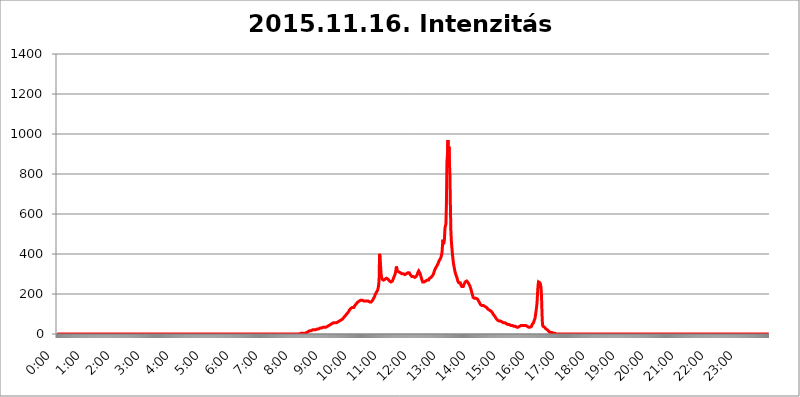
| Category | 2015.11.16. Intenzitás [W/m^2] |
|---|---|
| 0.0 | 0 |
| 0.0006944444444444445 | 0 |
| 0.001388888888888889 | 0 |
| 0.0020833333333333333 | 0 |
| 0.002777777777777778 | 0 |
| 0.003472222222222222 | 0 |
| 0.004166666666666667 | 0 |
| 0.004861111111111111 | 0 |
| 0.005555555555555556 | 0 |
| 0.0062499999999999995 | 0 |
| 0.006944444444444444 | 0 |
| 0.007638888888888889 | 0 |
| 0.008333333333333333 | 0 |
| 0.009027777777777779 | 0 |
| 0.009722222222222222 | 0 |
| 0.010416666666666666 | 0 |
| 0.011111111111111112 | 0 |
| 0.011805555555555555 | 0 |
| 0.012499999999999999 | 0 |
| 0.013194444444444444 | 0 |
| 0.013888888888888888 | 0 |
| 0.014583333333333332 | 0 |
| 0.015277777777777777 | 0 |
| 0.015972222222222224 | 0 |
| 0.016666666666666666 | 0 |
| 0.017361111111111112 | 0 |
| 0.018055555555555557 | 0 |
| 0.01875 | 0 |
| 0.019444444444444445 | 0 |
| 0.02013888888888889 | 0 |
| 0.020833333333333332 | 0 |
| 0.02152777777777778 | 0 |
| 0.022222222222222223 | 0 |
| 0.02291666666666667 | 0 |
| 0.02361111111111111 | 0 |
| 0.024305555555555556 | 0 |
| 0.024999999999999998 | 0 |
| 0.025694444444444447 | 0 |
| 0.02638888888888889 | 0 |
| 0.027083333333333334 | 0 |
| 0.027777777777777776 | 0 |
| 0.02847222222222222 | 0 |
| 0.029166666666666664 | 0 |
| 0.029861111111111113 | 0 |
| 0.030555555555555555 | 0 |
| 0.03125 | 0 |
| 0.03194444444444445 | 0 |
| 0.03263888888888889 | 0 |
| 0.03333333333333333 | 0 |
| 0.034027777777777775 | 0 |
| 0.034722222222222224 | 0 |
| 0.035416666666666666 | 0 |
| 0.036111111111111115 | 0 |
| 0.03680555555555556 | 0 |
| 0.0375 | 0 |
| 0.03819444444444444 | 0 |
| 0.03888888888888889 | 0 |
| 0.03958333333333333 | 0 |
| 0.04027777777777778 | 0 |
| 0.04097222222222222 | 0 |
| 0.041666666666666664 | 0 |
| 0.042361111111111106 | 0 |
| 0.04305555555555556 | 0 |
| 0.043750000000000004 | 0 |
| 0.044444444444444446 | 0 |
| 0.04513888888888889 | 0 |
| 0.04583333333333334 | 0 |
| 0.04652777777777778 | 0 |
| 0.04722222222222222 | 0 |
| 0.04791666666666666 | 0 |
| 0.04861111111111111 | 0 |
| 0.049305555555555554 | 0 |
| 0.049999999999999996 | 0 |
| 0.05069444444444445 | 0 |
| 0.051388888888888894 | 0 |
| 0.052083333333333336 | 0 |
| 0.05277777777777778 | 0 |
| 0.05347222222222222 | 0 |
| 0.05416666666666667 | 0 |
| 0.05486111111111111 | 0 |
| 0.05555555555555555 | 0 |
| 0.05625 | 0 |
| 0.05694444444444444 | 0 |
| 0.057638888888888885 | 0 |
| 0.05833333333333333 | 0 |
| 0.05902777777777778 | 0 |
| 0.059722222222222225 | 0 |
| 0.06041666666666667 | 0 |
| 0.061111111111111116 | 0 |
| 0.06180555555555556 | 0 |
| 0.0625 | 0 |
| 0.06319444444444444 | 0 |
| 0.06388888888888888 | 0 |
| 0.06458333333333334 | 0 |
| 0.06527777777777778 | 0 |
| 0.06597222222222222 | 0 |
| 0.06666666666666667 | 0 |
| 0.06736111111111111 | 0 |
| 0.06805555555555555 | 0 |
| 0.06874999999999999 | 0 |
| 0.06944444444444443 | 0 |
| 0.07013888888888889 | 0 |
| 0.07083333333333333 | 0 |
| 0.07152777777777779 | 0 |
| 0.07222222222222223 | 0 |
| 0.07291666666666667 | 0 |
| 0.07361111111111111 | 0 |
| 0.07430555555555556 | 0 |
| 0.075 | 0 |
| 0.07569444444444444 | 0 |
| 0.0763888888888889 | 0 |
| 0.07708333333333334 | 0 |
| 0.07777777777777778 | 0 |
| 0.07847222222222222 | 0 |
| 0.07916666666666666 | 0 |
| 0.0798611111111111 | 0 |
| 0.08055555555555556 | 0 |
| 0.08125 | 0 |
| 0.08194444444444444 | 0 |
| 0.08263888888888889 | 0 |
| 0.08333333333333333 | 0 |
| 0.08402777777777777 | 0 |
| 0.08472222222222221 | 0 |
| 0.08541666666666665 | 0 |
| 0.08611111111111112 | 0 |
| 0.08680555555555557 | 0 |
| 0.08750000000000001 | 0 |
| 0.08819444444444445 | 0 |
| 0.08888888888888889 | 0 |
| 0.08958333333333333 | 0 |
| 0.09027777777777778 | 0 |
| 0.09097222222222222 | 0 |
| 0.09166666666666667 | 0 |
| 0.09236111111111112 | 0 |
| 0.09305555555555556 | 0 |
| 0.09375 | 0 |
| 0.09444444444444444 | 0 |
| 0.09513888888888888 | 0 |
| 0.09583333333333333 | 0 |
| 0.09652777777777777 | 0 |
| 0.09722222222222222 | 0 |
| 0.09791666666666667 | 0 |
| 0.09861111111111111 | 0 |
| 0.09930555555555555 | 0 |
| 0.09999999999999999 | 0 |
| 0.10069444444444443 | 0 |
| 0.1013888888888889 | 0 |
| 0.10208333333333335 | 0 |
| 0.10277777777777779 | 0 |
| 0.10347222222222223 | 0 |
| 0.10416666666666667 | 0 |
| 0.10486111111111111 | 0 |
| 0.10555555555555556 | 0 |
| 0.10625 | 0 |
| 0.10694444444444444 | 0 |
| 0.1076388888888889 | 0 |
| 0.10833333333333334 | 0 |
| 0.10902777777777778 | 0 |
| 0.10972222222222222 | 0 |
| 0.1111111111111111 | 0 |
| 0.11180555555555556 | 0 |
| 0.11180555555555556 | 0 |
| 0.1125 | 0 |
| 0.11319444444444444 | 0 |
| 0.11388888888888889 | 0 |
| 0.11458333333333333 | 0 |
| 0.11527777777777777 | 0 |
| 0.11597222222222221 | 0 |
| 0.11666666666666665 | 0 |
| 0.1173611111111111 | 0 |
| 0.11805555555555557 | 0 |
| 0.11944444444444445 | 0 |
| 0.12013888888888889 | 0 |
| 0.12083333333333333 | 0 |
| 0.12152777777777778 | 0 |
| 0.12222222222222223 | 0 |
| 0.12291666666666667 | 0 |
| 0.12291666666666667 | 0 |
| 0.12361111111111112 | 0 |
| 0.12430555555555556 | 0 |
| 0.125 | 0 |
| 0.12569444444444444 | 0 |
| 0.12638888888888888 | 0 |
| 0.12708333333333333 | 0 |
| 0.16875 | 0 |
| 0.12847222222222224 | 0 |
| 0.12916666666666668 | 0 |
| 0.12986111111111112 | 0 |
| 0.13055555555555556 | 0 |
| 0.13125 | 0 |
| 0.13194444444444445 | 0 |
| 0.1326388888888889 | 0 |
| 0.13333333333333333 | 0 |
| 0.13402777777777777 | 0 |
| 0.13402777777777777 | 0 |
| 0.13472222222222222 | 0 |
| 0.13541666666666666 | 0 |
| 0.1361111111111111 | 0 |
| 0.13749999999999998 | 0 |
| 0.13819444444444443 | 0 |
| 0.1388888888888889 | 0 |
| 0.13958333333333334 | 0 |
| 0.14027777777777778 | 0 |
| 0.14097222222222222 | 0 |
| 0.14166666666666666 | 0 |
| 0.1423611111111111 | 0 |
| 0.14305555555555557 | 0 |
| 0.14375000000000002 | 0 |
| 0.14444444444444446 | 0 |
| 0.1451388888888889 | 0 |
| 0.1451388888888889 | 0 |
| 0.14652777777777778 | 0 |
| 0.14722222222222223 | 0 |
| 0.14791666666666667 | 0 |
| 0.1486111111111111 | 0 |
| 0.14930555555555555 | 0 |
| 0.15 | 0 |
| 0.15069444444444444 | 0 |
| 0.15138888888888888 | 0 |
| 0.15208333333333332 | 0 |
| 0.15277777777777776 | 0 |
| 0.15347222222222223 | 0 |
| 0.15416666666666667 | 0 |
| 0.15486111111111112 | 0 |
| 0.15555555555555556 | 0 |
| 0.15625 | 0 |
| 0.15694444444444444 | 0 |
| 0.15763888888888888 | 0 |
| 0.15833333333333333 | 0 |
| 0.15902777777777777 | 0 |
| 0.15972222222222224 | 0 |
| 0.16041666666666668 | 0 |
| 0.16111111111111112 | 0 |
| 0.16180555555555556 | 0 |
| 0.1625 | 0 |
| 0.16319444444444445 | 0 |
| 0.1638888888888889 | 0 |
| 0.16458333333333333 | 0 |
| 0.16527777777777777 | 0 |
| 0.16597222222222222 | 0 |
| 0.16666666666666666 | 0 |
| 0.1673611111111111 | 0 |
| 0.16805555555555554 | 0 |
| 0.16874999999999998 | 0 |
| 0.16944444444444443 | 0 |
| 0.17013888888888887 | 0 |
| 0.1708333333333333 | 0 |
| 0.17152777777777775 | 0 |
| 0.17222222222222225 | 0 |
| 0.1729166666666667 | 0 |
| 0.17361111111111113 | 0 |
| 0.17430555555555557 | 0 |
| 0.17500000000000002 | 0 |
| 0.17569444444444446 | 0 |
| 0.1763888888888889 | 0 |
| 0.17708333333333334 | 0 |
| 0.17777777777777778 | 0 |
| 0.17847222222222223 | 0 |
| 0.17916666666666667 | 0 |
| 0.1798611111111111 | 0 |
| 0.18055555555555555 | 0 |
| 0.18125 | 0 |
| 0.18194444444444444 | 0 |
| 0.1826388888888889 | 0 |
| 0.18333333333333335 | 0 |
| 0.1840277777777778 | 0 |
| 0.18472222222222223 | 0 |
| 0.18541666666666667 | 0 |
| 0.18611111111111112 | 0 |
| 0.18680555555555556 | 0 |
| 0.1875 | 0 |
| 0.18819444444444444 | 0 |
| 0.18888888888888888 | 0 |
| 0.18958333333333333 | 0 |
| 0.19027777777777777 | 0 |
| 0.1909722222222222 | 0 |
| 0.19166666666666665 | 0 |
| 0.19236111111111112 | 0 |
| 0.19305555555555554 | 0 |
| 0.19375 | 0 |
| 0.19444444444444445 | 0 |
| 0.1951388888888889 | 0 |
| 0.19583333333333333 | 0 |
| 0.19652777777777777 | 0 |
| 0.19722222222222222 | 0 |
| 0.19791666666666666 | 0 |
| 0.1986111111111111 | 0 |
| 0.19930555555555554 | 0 |
| 0.19999999999999998 | 0 |
| 0.20069444444444443 | 0 |
| 0.20138888888888887 | 0 |
| 0.2020833333333333 | 0 |
| 0.2027777777777778 | 0 |
| 0.2034722222222222 | 0 |
| 0.2041666666666667 | 0 |
| 0.20486111111111113 | 0 |
| 0.20555555555555557 | 0 |
| 0.20625000000000002 | 0 |
| 0.20694444444444446 | 0 |
| 0.2076388888888889 | 0 |
| 0.20833333333333334 | 0 |
| 0.20902777777777778 | 0 |
| 0.20972222222222223 | 0 |
| 0.21041666666666667 | 0 |
| 0.2111111111111111 | 0 |
| 0.21180555555555555 | 0 |
| 0.2125 | 0 |
| 0.21319444444444444 | 0 |
| 0.2138888888888889 | 0 |
| 0.21458333333333335 | 0 |
| 0.2152777777777778 | 0 |
| 0.21597222222222223 | 0 |
| 0.21666666666666667 | 0 |
| 0.21736111111111112 | 0 |
| 0.21805555555555556 | 0 |
| 0.21875 | 0 |
| 0.21944444444444444 | 0 |
| 0.22013888888888888 | 0 |
| 0.22083333333333333 | 0 |
| 0.22152777777777777 | 0 |
| 0.2222222222222222 | 0 |
| 0.22291666666666665 | 0 |
| 0.2236111111111111 | 0 |
| 0.22430555555555556 | 0 |
| 0.225 | 0 |
| 0.22569444444444445 | 0 |
| 0.2263888888888889 | 0 |
| 0.22708333333333333 | 0 |
| 0.22777777777777777 | 0 |
| 0.22847222222222222 | 0 |
| 0.22916666666666666 | 0 |
| 0.2298611111111111 | 0 |
| 0.23055555555555554 | 0 |
| 0.23124999999999998 | 0 |
| 0.23194444444444443 | 0 |
| 0.23263888888888887 | 0 |
| 0.2333333333333333 | 0 |
| 0.2340277777777778 | 0 |
| 0.2347222222222222 | 0 |
| 0.2354166666666667 | 0 |
| 0.23611111111111113 | 0 |
| 0.23680555555555557 | 0 |
| 0.23750000000000002 | 0 |
| 0.23819444444444446 | 0 |
| 0.2388888888888889 | 0 |
| 0.23958333333333334 | 0 |
| 0.24027777777777778 | 0 |
| 0.24097222222222223 | 0 |
| 0.24166666666666667 | 0 |
| 0.2423611111111111 | 0 |
| 0.24305555555555555 | 0 |
| 0.24375 | 0 |
| 0.24444444444444446 | 0 |
| 0.24513888888888888 | 0 |
| 0.24583333333333335 | 0 |
| 0.2465277777777778 | 0 |
| 0.24722222222222223 | 0 |
| 0.24791666666666667 | 0 |
| 0.24861111111111112 | 0 |
| 0.24930555555555556 | 0 |
| 0.25 | 0 |
| 0.25069444444444444 | 0 |
| 0.2513888888888889 | 0 |
| 0.2520833333333333 | 0 |
| 0.25277777777777777 | 0 |
| 0.2534722222222222 | 0 |
| 0.25416666666666665 | 0 |
| 0.2548611111111111 | 0 |
| 0.2555555555555556 | 0 |
| 0.25625000000000003 | 0 |
| 0.2569444444444445 | 0 |
| 0.2576388888888889 | 0 |
| 0.25833333333333336 | 0 |
| 0.2590277777777778 | 0 |
| 0.25972222222222224 | 0 |
| 0.2604166666666667 | 0 |
| 0.2611111111111111 | 0 |
| 0.26180555555555557 | 0 |
| 0.2625 | 0 |
| 0.26319444444444445 | 0 |
| 0.2638888888888889 | 0 |
| 0.26458333333333334 | 0 |
| 0.2652777777777778 | 0 |
| 0.2659722222222222 | 0 |
| 0.26666666666666666 | 0 |
| 0.2673611111111111 | 0 |
| 0.26805555555555555 | 0 |
| 0.26875 | 0 |
| 0.26944444444444443 | 0 |
| 0.2701388888888889 | 0 |
| 0.2708333333333333 | 0 |
| 0.27152777777777776 | 0 |
| 0.2722222222222222 | 0 |
| 0.27291666666666664 | 0 |
| 0.2736111111111111 | 0 |
| 0.2743055555555555 | 0 |
| 0.27499999999999997 | 0 |
| 0.27569444444444446 | 0 |
| 0.27638888888888885 | 0 |
| 0.27708333333333335 | 0 |
| 0.2777777777777778 | 0 |
| 0.27847222222222223 | 0 |
| 0.2791666666666667 | 0 |
| 0.2798611111111111 | 0 |
| 0.28055555555555556 | 0 |
| 0.28125 | 0 |
| 0.28194444444444444 | 0 |
| 0.2826388888888889 | 0 |
| 0.2833333333333333 | 0 |
| 0.28402777777777777 | 0 |
| 0.2847222222222222 | 0 |
| 0.28541666666666665 | 0 |
| 0.28611111111111115 | 0 |
| 0.28680555555555554 | 0 |
| 0.28750000000000003 | 0 |
| 0.2881944444444445 | 0 |
| 0.2888888888888889 | 0 |
| 0.28958333333333336 | 0 |
| 0.2902777777777778 | 0 |
| 0.29097222222222224 | 0 |
| 0.2916666666666667 | 0 |
| 0.2923611111111111 | 0 |
| 0.29305555555555557 | 0 |
| 0.29375 | 0 |
| 0.29444444444444445 | 0 |
| 0.2951388888888889 | 0 |
| 0.29583333333333334 | 0 |
| 0.2965277777777778 | 0 |
| 0.2972222222222222 | 0 |
| 0.29791666666666666 | 0 |
| 0.2986111111111111 | 0 |
| 0.29930555555555555 | 0 |
| 0.3 | 0 |
| 0.30069444444444443 | 0 |
| 0.3013888888888889 | 0 |
| 0.3020833333333333 | 0 |
| 0.30277777777777776 | 0 |
| 0.3034722222222222 | 0 |
| 0.30416666666666664 | 0 |
| 0.3048611111111111 | 0 |
| 0.3055555555555555 | 0 |
| 0.30624999999999997 | 0 |
| 0.3069444444444444 | 0 |
| 0.3076388888888889 | 0 |
| 0.30833333333333335 | 0 |
| 0.3090277777777778 | 0 |
| 0.30972222222222223 | 0 |
| 0.3104166666666667 | 0 |
| 0.3111111111111111 | 0 |
| 0.31180555555555556 | 0 |
| 0.3125 | 0 |
| 0.31319444444444444 | 0 |
| 0.3138888888888889 | 0 |
| 0.3145833333333333 | 0 |
| 0.31527777777777777 | 0 |
| 0.3159722222222222 | 0 |
| 0.31666666666666665 | 0 |
| 0.31736111111111115 | 0 |
| 0.31805555555555554 | 0 |
| 0.31875000000000003 | 0 |
| 0.3194444444444445 | 0 |
| 0.3201388888888889 | 0 |
| 0.32083333333333336 | 0 |
| 0.3215277777777778 | 0 |
| 0.32222222222222224 | 0 |
| 0.3229166666666667 | 0 |
| 0.3236111111111111 | 0 |
| 0.32430555555555557 | 0 |
| 0.325 | 0 |
| 0.32569444444444445 | 0 |
| 0.3263888888888889 | 0 |
| 0.32708333333333334 | 0 |
| 0.3277777777777778 | 0 |
| 0.3284722222222222 | 0 |
| 0.32916666666666666 | 0 |
| 0.3298611111111111 | 0 |
| 0.33055555555555555 | 0 |
| 0.33125 | 0 |
| 0.33194444444444443 | 0 |
| 0.3326388888888889 | 0 |
| 0.3333333333333333 | 0 |
| 0.3340277777777778 | 0 |
| 0.3347222222222222 | 0 |
| 0.3354166666666667 | 0 |
| 0.3361111111111111 | 0 |
| 0.3368055555555556 | 0 |
| 0.33749999999999997 | 0 |
| 0.33819444444444446 | 0 |
| 0.33888888888888885 | 0 |
| 0.33958333333333335 | 0 |
| 0.34027777777777773 | 3.525 |
| 0.34097222222222223 | 3.525 |
| 0.3416666666666666 | 3.525 |
| 0.3423611111111111 | 3.525 |
| 0.3430555555555555 | 3.525 |
| 0.34375 | 3.525 |
| 0.3444444444444445 | 3.525 |
| 0.3451388888888889 | 3.525 |
| 0.3458333333333334 | 3.525 |
| 0.34652777777777777 | 3.525 |
| 0.34722222222222227 | 3.525 |
| 0.34791666666666665 | 3.525 |
| 0.34861111111111115 | 3.525 |
| 0.34930555555555554 | 7.887 |
| 0.35000000000000003 | 7.887 |
| 0.3506944444444444 | 7.887 |
| 0.3513888888888889 | 12.257 |
| 0.3520833333333333 | 12.257 |
| 0.3527777777777778 | 12.257 |
| 0.3534722222222222 | 12.257 |
| 0.3541666666666667 | 16.636 |
| 0.3548611111111111 | 16.636 |
| 0.35555555555555557 | 16.636 |
| 0.35625 | 16.636 |
| 0.35694444444444445 | 16.636 |
| 0.3576388888888889 | 16.636 |
| 0.35833333333333334 | 21.024 |
| 0.3590277777777778 | 21.024 |
| 0.3597222222222222 | 21.024 |
| 0.36041666666666666 | 21.024 |
| 0.3611111111111111 | 21.024 |
| 0.36180555555555555 | 21.024 |
| 0.3625 | 21.024 |
| 0.36319444444444443 | 21.024 |
| 0.3638888888888889 | 25.419 |
| 0.3645833333333333 | 25.419 |
| 0.3652777777777778 | 25.419 |
| 0.3659722222222222 | 25.419 |
| 0.3666666666666667 | 25.419 |
| 0.3673611111111111 | 25.419 |
| 0.3680555555555556 | 29.823 |
| 0.36874999999999997 | 29.823 |
| 0.36944444444444446 | 25.419 |
| 0.37013888888888885 | 29.823 |
| 0.37083333333333335 | 29.823 |
| 0.37152777777777773 | 29.823 |
| 0.37222222222222223 | 29.823 |
| 0.3729166666666666 | 34.234 |
| 0.3736111111111111 | 34.234 |
| 0.3743055555555555 | 34.234 |
| 0.375 | 34.234 |
| 0.3756944444444445 | 34.234 |
| 0.3763888888888889 | 34.234 |
| 0.3770833333333334 | 34.234 |
| 0.37777777777777777 | 38.653 |
| 0.37847222222222227 | 38.653 |
| 0.37916666666666665 | 38.653 |
| 0.37986111111111115 | 38.653 |
| 0.38055555555555554 | 38.653 |
| 0.38125000000000003 | 43.079 |
| 0.3819444444444444 | 43.079 |
| 0.3826388888888889 | 47.511 |
| 0.3833333333333333 | 47.511 |
| 0.3840277777777778 | 51.951 |
| 0.3847222222222222 | 51.951 |
| 0.3854166666666667 | 51.951 |
| 0.3861111111111111 | 56.398 |
| 0.38680555555555557 | 51.951 |
| 0.3875 | 56.398 |
| 0.38819444444444445 | 56.398 |
| 0.3888888888888889 | 56.398 |
| 0.38958333333333334 | 56.398 |
| 0.3902777777777778 | 56.398 |
| 0.3909722222222222 | 56.398 |
| 0.39166666666666666 | 56.398 |
| 0.3923611111111111 | 56.398 |
| 0.39305555555555555 | 56.398 |
| 0.39375 | 60.85 |
| 0.39444444444444443 | 60.85 |
| 0.3951388888888889 | 60.85 |
| 0.3958333333333333 | 65.31 |
| 0.3965277777777778 | 65.31 |
| 0.3972222222222222 | 65.31 |
| 0.3979166666666667 | 69.775 |
| 0.3986111111111111 | 69.775 |
| 0.3993055555555556 | 69.775 |
| 0.39999999999999997 | 74.246 |
| 0.40069444444444446 | 74.246 |
| 0.40138888888888885 | 78.722 |
| 0.40208333333333335 | 83.205 |
| 0.40277777777777773 | 83.205 |
| 0.40347222222222223 | 87.692 |
| 0.4041666666666666 | 92.184 |
| 0.4048611111111111 | 92.184 |
| 0.4055555555555555 | 96.682 |
| 0.40625 | 101.184 |
| 0.4069444444444445 | 101.184 |
| 0.4076388888888889 | 105.69 |
| 0.4083333333333334 | 110.201 |
| 0.40902777777777777 | 114.716 |
| 0.40972222222222227 | 119.235 |
| 0.41041666666666665 | 119.235 |
| 0.41111111111111115 | 123.758 |
| 0.41180555555555554 | 128.284 |
| 0.41250000000000003 | 128.284 |
| 0.4131944444444444 | 132.814 |
| 0.4138888888888889 | 132.814 |
| 0.4145833333333333 | 128.284 |
| 0.4152777777777778 | 132.814 |
| 0.4159722222222222 | 132.814 |
| 0.4166666666666667 | 137.347 |
| 0.4173611111111111 | 141.884 |
| 0.41805555555555557 | 146.423 |
| 0.41875 | 146.423 |
| 0.41944444444444445 | 150.964 |
| 0.4201388888888889 | 155.509 |
| 0.42083333333333334 | 155.509 |
| 0.4215277777777778 | 160.056 |
| 0.4222222222222222 | 160.056 |
| 0.42291666666666666 | 164.605 |
| 0.4236111111111111 | 164.605 |
| 0.42430555555555555 | 164.605 |
| 0.425 | 164.605 |
| 0.42569444444444443 | 169.156 |
| 0.4263888888888889 | 169.156 |
| 0.4270833333333333 | 169.156 |
| 0.4277777777777778 | 169.156 |
| 0.4284722222222222 | 169.156 |
| 0.4291666666666667 | 164.605 |
| 0.4298611111111111 | 164.605 |
| 0.4305555555555556 | 164.605 |
| 0.43124999999999997 | 164.605 |
| 0.43194444444444446 | 164.605 |
| 0.43263888888888885 | 164.605 |
| 0.43333333333333335 | 169.156 |
| 0.43402777777777773 | 164.605 |
| 0.43472222222222223 | 164.605 |
| 0.4354166666666666 | 164.605 |
| 0.4361111111111111 | 164.605 |
| 0.4368055555555555 | 160.056 |
| 0.4375 | 160.056 |
| 0.4381944444444445 | 160.056 |
| 0.4388888888888889 | 160.056 |
| 0.4395833333333334 | 160.056 |
| 0.44027777777777777 | 160.056 |
| 0.44097222222222227 | 164.605 |
| 0.44166666666666665 | 164.605 |
| 0.44236111111111115 | 169.156 |
| 0.44305555555555554 | 173.709 |
| 0.44375000000000003 | 178.264 |
| 0.4444444444444444 | 182.82 |
| 0.4451388888888889 | 187.378 |
| 0.4458333333333333 | 196.497 |
| 0.4465277777777778 | 201.058 |
| 0.4472222222222222 | 201.058 |
| 0.4479166666666667 | 210.182 |
| 0.4486111111111111 | 210.182 |
| 0.44930555555555557 | 219.309 |
| 0.45 | 228.436 |
| 0.45069444444444445 | 242.127 |
| 0.4513888888888889 | 269.49 |
| 0.45208333333333334 | 400.638 |
| 0.4527777777777778 | 382.715 |
| 0.4534722222222222 | 342.162 |
| 0.45416666666666666 | 301.354 |
| 0.4548611111111111 | 283.156 |
| 0.45555555555555555 | 274.047 |
| 0.45625 | 269.49 |
| 0.45694444444444443 | 269.49 |
| 0.4576388888888889 | 269.49 |
| 0.4583333333333333 | 269.49 |
| 0.4590277777777778 | 269.49 |
| 0.4597222222222222 | 274.047 |
| 0.4604166666666667 | 274.047 |
| 0.4611111111111111 | 274.047 |
| 0.4618055555555556 | 278.603 |
| 0.46249999999999997 | 278.603 |
| 0.46319444444444446 | 278.603 |
| 0.46388888888888885 | 274.047 |
| 0.46458333333333335 | 274.047 |
| 0.46527777777777773 | 269.49 |
| 0.46597222222222223 | 264.932 |
| 0.4666666666666666 | 260.373 |
| 0.4673611111111111 | 260.373 |
| 0.4680555555555555 | 260.373 |
| 0.46875 | 260.373 |
| 0.4694444444444445 | 260.373 |
| 0.4701388888888889 | 264.932 |
| 0.4708333333333334 | 269.49 |
| 0.47152777777777777 | 278.603 |
| 0.47222222222222227 | 274.047 |
| 0.47291666666666665 | 283.156 |
| 0.47361111111111115 | 296.808 |
| 0.47430555555555554 | 305.898 |
| 0.47500000000000003 | 319.517 |
| 0.4756944444444444 | 337.639 |
| 0.4763888888888889 | 324.052 |
| 0.4770833333333333 | 314.98 |
| 0.4777777777777778 | 314.98 |
| 0.4784722222222222 | 314.98 |
| 0.4791666666666667 | 310.44 |
| 0.4798611111111111 | 310.44 |
| 0.48055555555555557 | 305.898 |
| 0.48125 | 305.898 |
| 0.48194444444444445 | 301.354 |
| 0.4826388888888889 | 301.354 |
| 0.48333333333333334 | 301.354 |
| 0.4840277777777778 | 305.898 |
| 0.4847222222222222 | 301.354 |
| 0.48541666666666666 | 301.354 |
| 0.4861111111111111 | 296.808 |
| 0.48680555555555555 | 296.808 |
| 0.4875 | 296.808 |
| 0.48819444444444443 | 296.808 |
| 0.4888888888888889 | 296.808 |
| 0.4895833333333333 | 301.354 |
| 0.4902777777777778 | 301.354 |
| 0.4909722222222222 | 305.898 |
| 0.4916666666666667 | 305.898 |
| 0.4923611111111111 | 305.898 |
| 0.4930555555555556 | 305.898 |
| 0.49374999999999997 | 305.898 |
| 0.49444444444444446 | 301.354 |
| 0.49513888888888885 | 296.808 |
| 0.49583333333333335 | 292.259 |
| 0.49652777777777773 | 292.259 |
| 0.49722222222222223 | 287.709 |
| 0.4979166666666666 | 287.709 |
| 0.4986111111111111 | 287.709 |
| 0.4993055555555555 | 287.709 |
| 0.5 | 283.156 |
| 0.5006944444444444 | 283.156 |
| 0.5013888888888889 | 283.156 |
| 0.5020833333333333 | 283.156 |
| 0.5027777777777778 | 287.709 |
| 0.5034722222222222 | 287.709 |
| 0.5041666666666667 | 292.259 |
| 0.5048611111111111 | 296.808 |
| 0.5055555555555555 | 305.898 |
| 0.50625 | 310.44 |
| 0.5069444444444444 | 314.98 |
| 0.5076388888888889 | 314.98 |
| 0.5083333333333333 | 310.44 |
| 0.5090277777777777 | 301.354 |
| 0.5097222222222222 | 292.259 |
| 0.5104166666666666 | 283.156 |
| 0.5111111111111112 | 274.047 |
| 0.5118055555555555 | 269.49 |
| 0.5125000000000001 | 260.373 |
| 0.5131944444444444 | 260.373 |
| 0.513888888888889 | 260.373 |
| 0.5145833333333333 | 260.373 |
| 0.5152777777777778 | 260.373 |
| 0.5159722222222222 | 264.932 |
| 0.5166666666666667 | 264.932 |
| 0.517361111111111 | 269.49 |
| 0.5180555555555556 | 269.49 |
| 0.5187499999999999 | 269.49 |
| 0.5194444444444445 | 269.49 |
| 0.5201388888888888 | 269.49 |
| 0.5208333333333334 | 269.49 |
| 0.5215277777777778 | 274.047 |
| 0.5222222222222223 | 278.603 |
| 0.5229166666666667 | 278.603 |
| 0.5236111111111111 | 278.603 |
| 0.5243055555555556 | 283.156 |
| 0.525 | 287.709 |
| 0.5256944444444445 | 287.709 |
| 0.5263888888888889 | 292.259 |
| 0.5270833333333333 | 296.808 |
| 0.5277777777777778 | 301.354 |
| 0.5284722222222222 | 310.44 |
| 0.5291666666666667 | 314.98 |
| 0.5298611111111111 | 324.052 |
| 0.5305555555555556 | 328.584 |
| 0.53125 | 333.113 |
| 0.5319444444444444 | 337.639 |
| 0.5326388888888889 | 342.162 |
| 0.5333333333333333 | 346.682 |
| 0.5340277777777778 | 351.198 |
| 0.5347222222222222 | 355.712 |
| 0.5354166666666667 | 364.728 |
| 0.5361111111111111 | 369.23 |
| 0.5368055555555555 | 373.729 |
| 0.5375 | 378.224 |
| 0.5381944444444444 | 382.715 |
| 0.5388888888888889 | 387.202 |
| 0.5395833333333333 | 405.108 |
| 0.5402777777777777 | 440.702 |
| 0.5409722222222222 | 471.582 |
| 0.5416666666666666 | 449.551 |
| 0.5423611111111112 | 458.38 |
| 0.5430555555555555 | 471.582 |
| 0.5437500000000001 | 528.2 |
| 0.5444444444444444 | 541.121 |
| 0.545138888888889 | 549.704 |
| 0.5458333333333333 | 650.667 |
| 0.5465277777777778 | 860.676 |
| 0.5472222222222222 | 894.885 |
| 0.5479166666666667 | 970.034 |
| 0.548611111111111 | 872.114 |
| 0.5493055555555556 | 936.33 |
| 0.5499999999999999 | 856.855 |
| 0.5506944444444445 | 798.974 |
| 0.5513888888888888 | 642.4 |
| 0.5520833333333334 | 515.223 |
| 0.5527777777777778 | 462.786 |
| 0.5534722222222223 | 431.833 |
| 0.5541666666666667 | 405.108 |
| 0.5548611111111111 | 378.224 |
| 0.5555555555555556 | 355.712 |
| 0.55625 | 342.162 |
| 0.5569444444444445 | 328.584 |
| 0.5576388888888889 | 314.98 |
| 0.5583333333333333 | 305.898 |
| 0.5590277777777778 | 296.808 |
| 0.5597222222222222 | 292.259 |
| 0.5604166666666667 | 283.156 |
| 0.5611111111111111 | 274.047 |
| 0.5618055555555556 | 264.932 |
| 0.5625 | 260.373 |
| 0.5631944444444444 | 255.813 |
| 0.5638888888888889 | 255.813 |
| 0.5645833333333333 | 255.813 |
| 0.5652777777777778 | 255.813 |
| 0.5659722222222222 | 246.689 |
| 0.5666666666666667 | 242.127 |
| 0.5673611111111111 | 237.564 |
| 0.5680555555555555 | 233 |
| 0.56875 | 233 |
| 0.5694444444444444 | 237.564 |
| 0.5701388888888889 | 242.127 |
| 0.5708333333333333 | 251.251 |
| 0.5715277777777777 | 255.813 |
| 0.5722222222222222 | 260.373 |
| 0.5729166666666666 | 264.932 |
| 0.5736111111111112 | 264.932 |
| 0.5743055555555555 | 264.932 |
| 0.5750000000000001 | 260.373 |
| 0.5756944444444444 | 260.373 |
| 0.576388888888889 | 255.813 |
| 0.5770833333333333 | 255.813 |
| 0.5777777777777778 | 251.251 |
| 0.5784722222222222 | 242.127 |
| 0.5791666666666667 | 237.564 |
| 0.579861111111111 | 228.436 |
| 0.5805555555555556 | 219.309 |
| 0.5812499999999999 | 210.182 |
| 0.5819444444444445 | 201.058 |
| 0.5826388888888888 | 191.937 |
| 0.5833333333333334 | 182.82 |
| 0.5840277777777778 | 182.82 |
| 0.5847222222222223 | 178.264 |
| 0.5854166666666667 | 178.264 |
| 0.5861111111111111 | 178.264 |
| 0.5868055555555556 | 178.264 |
| 0.5875 | 178.264 |
| 0.5881944444444445 | 173.709 |
| 0.5888888888888889 | 173.709 |
| 0.5895833333333333 | 173.709 |
| 0.5902777777777778 | 169.156 |
| 0.5909722222222222 | 164.605 |
| 0.5916666666666667 | 160.056 |
| 0.5923611111111111 | 155.509 |
| 0.5930555555555556 | 150.964 |
| 0.59375 | 146.423 |
| 0.5944444444444444 | 146.423 |
| 0.5951388888888889 | 146.423 |
| 0.5958333333333333 | 141.884 |
| 0.5965277777777778 | 141.884 |
| 0.5972222222222222 | 141.884 |
| 0.5979166666666667 | 141.884 |
| 0.5986111111111111 | 137.347 |
| 0.5993055555555555 | 137.347 |
| 0.6 | 137.347 |
| 0.6006944444444444 | 132.814 |
| 0.6013888888888889 | 132.814 |
| 0.6020833333333333 | 132.814 |
| 0.6027777777777777 | 128.284 |
| 0.6034722222222222 | 128.284 |
| 0.6041666666666666 | 123.758 |
| 0.6048611111111112 | 123.758 |
| 0.6055555555555555 | 119.235 |
| 0.6062500000000001 | 119.235 |
| 0.6069444444444444 | 119.235 |
| 0.607638888888889 | 114.716 |
| 0.6083333333333333 | 114.716 |
| 0.6090277777777778 | 110.201 |
| 0.6097222222222222 | 110.201 |
| 0.6104166666666667 | 105.69 |
| 0.611111111111111 | 101.184 |
| 0.6118055555555556 | 96.682 |
| 0.6124999999999999 | 92.184 |
| 0.6131944444444445 | 92.184 |
| 0.6138888888888888 | 87.692 |
| 0.6145833333333334 | 83.205 |
| 0.6152777777777778 | 78.722 |
| 0.6159722222222223 | 74.246 |
| 0.6166666666666667 | 74.246 |
| 0.6173611111111111 | 69.775 |
| 0.6180555555555556 | 65.31 |
| 0.61875 | 65.31 |
| 0.6194444444444445 | 65.31 |
| 0.6201388888888889 | 65.31 |
| 0.6208333333333333 | 65.31 |
| 0.6215277777777778 | 65.31 |
| 0.6222222222222222 | 60.85 |
| 0.6229166666666667 | 60.85 |
| 0.6236111111111111 | 60.85 |
| 0.6243055555555556 | 60.85 |
| 0.625 | 56.398 |
| 0.6256944444444444 | 56.398 |
| 0.6263888888888889 | 56.398 |
| 0.6270833333333333 | 56.398 |
| 0.6277777777777778 | 56.398 |
| 0.6284722222222222 | 56.398 |
| 0.6291666666666667 | 56.398 |
| 0.6298611111111111 | 51.951 |
| 0.6305555555555555 | 51.951 |
| 0.63125 | 51.951 |
| 0.6319444444444444 | 47.511 |
| 0.6326388888888889 | 47.511 |
| 0.6333333333333333 | 47.511 |
| 0.6340277777777777 | 47.511 |
| 0.6347222222222222 | 47.511 |
| 0.6354166666666666 | 47.511 |
| 0.6361111111111112 | 43.079 |
| 0.6368055555555555 | 43.079 |
| 0.6375000000000001 | 43.079 |
| 0.6381944444444444 | 43.079 |
| 0.638888888888889 | 38.653 |
| 0.6395833333333333 | 38.653 |
| 0.6402777777777778 | 38.653 |
| 0.6409722222222222 | 38.653 |
| 0.6416666666666667 | 38.653 |
| 0.642361111111111 | 38.653 |
| 0.6430555555555556 | 38.653 |
| 0.6437499999999999 | 34.234 |
| 0.6444444444444445 | 34.234 |
| 0.6451388888888888 | 34.234 |
| 0.6458333333333334 | 38.653 |
| 0.6465277777777778 | 34.234 |
| 0.6472222222222223 | 38.653 |
| 0.6479166666666667 | 38.653 |
| 0.6486111111111111 | 38.653 |
| 0.6493055555555556 | 38.653 |
| 0.65 | 38.653 |
| 0.6506944444444445 | 43.079 |
| 0.6513888888888889 | 43.079 |
| 0.6520833333333333 | 43.079 |
| 0.6527777777777778 | 43.079 |
| 0.6534722222222222 | 47.511 |
| 0.6541666666666667 | 47.511 |
| 0.6548611111111111 | 43.079 |
| 0.6555555555555556 | 43.079 |
| 0.65625 | 43.079 |
| 0.6569444444444444 | 43.079 |
| 0.6576388888888889 | 43.079 |
| 0.6583333333333333 | 38.653 |
| 0.6590277777777778 | 38.653 |
| 0.6597222222222222 | 38.653 |
| 0.6604166666666667 | 38.653 |
| 0.6611111111111111 | 34.234 |
| 0.6618055555555555 | 34.234 |
| 0.6625 | 34.234 |
| 0.6631944444444444 | 34.234 |
| 0.6638888888888889 | 34.234 |
| 0.6645833333333333 | 38.653 |
| 0.6652777777777777 | 38.653 |
| 0.6659722222222222 | 47.511 |
| 0.6666666666666666 | 47.511 |
| 0.6673611111111111 | 51.951 |
| 0.6680555555555556 | 56.398 |
| 0.6687500000000001 | 65.31 |
| 0.6694444444444444 | 69.775 |
| 0.6701388888888888 | 78.722 |
| 0.6708333333333334 | 96.682 |
| 0.6715277777777778 | 114.716 |
| 0.6722222222222222 | 132.814 |
| 0.6729166666666666 | 155.509 |
| 0.6736111111111112 | 201.058 |
| 0.6743055555555556 | 242.127 |
| 0.6749999999999999 | 260.373 |
| 0.6756944444444444 | 264.932 |
| 0.6763888888888889 | 264.932 |
| 0.6770833333333334 | 255.813 |
| 0.6777777777777777 | 246.689 |
| 0.6784722222222223 | 233 |
| 0.6791666666666667 | 191.937 |
| 0.6798611111111111 | 105.69 |
| 0.6805555555555555 | 47.511 |
| 0.68125 | 38.653 |
| 0.6819444444444445 | 38.653 |
| 0.6826388888888889 | 38.653 |
| 0.6833333333333332 | 34.234 |
| 0.6840277777777778 | 29.823 |
| 0.6847222222222222 | 29.823 |
| 0.6854166666666667 | 25.419 |
| 0.686111111111111 | 21.024 |
| 0.6868055555555556 | 21.024 |
| 0.6875 | 21.024 |
| 0.6881944444444444 | 16.636 |
| 0.688888888888889 | 16.636 |
| 0.6895833333333333 | 12.257 |
| 0.6902777777777778 | 12.257 |
| 0.6909722222222222 | 12.257 |
| 0.6916666666666668 | 7.887 |
| 0.6923611111111111 | 7.887 |
| 0.6930555555555555 | 7.887 |
| 0.69375 | 7.887 |
| 0.6944444444444445 | 3.525 |
| 0.6951388888888889 | 3.525 |
| 0.6958333333333333 | 3.525 |
| 0.6965277777777777 | 3.525 |
| 0.6972222222222223 | 3.525 |
| 0.6979166666666666 | 3.525 |
| 0.6986111111111111 | 0 |
| 0.6993055555555556 | 0 |
| 0.7000000000000001 | 0 |
| 0.7006944444444444 | 0 |
| 0.7013888888888888 | 0 |
| 0.7020833333333334 | 0 |
| 0.7027777777777778 | 0 |
| 0.7034722222222222 | 0 |
| 0.7041666666666666 | 0 |
| 0.7048611111111112 | 0 |
| 0.7055555555555556 | 0 |
| 0.7062499999999999 | 0 |
| 0.7069444444444444 | 0 |
| 0.7076388888888889 | 0 |
| 0.7083333333333334 | 0 |
| 0.7090277777777777 | 0 |
| 0.7097222222222223 | 0 |
| 0.7104166666666667 | 0 |
| 0.7111111111111111 | 0 |
| 0.7118055555555555 | 0 |
| 0.7125 | 0 |
| 0.7131944444444445 | 0 |
| 0.7138888888888889 | 0 |
| 0.7145833333333332 | 0 |
| 0.7152777777777778 | 0 |
| 0.7159722222222222 | 0 |
| 0.7166666666666667 | 0 |
| 0.717361111111111 | 0 |
| 0.7180555555555556 | 0 |
| 0.71875 | 0 |
| 0.7194444444444444 | 0 |
| 0.720138888888889 | 0 |
| 0.7208333333333333 | 0 |
| 0.7215277777777778 | 0 |
| 0.7222222222222222 | 0 |
| 0.7229166666666668 | 0 |
| 0.7236111111111111 | 0 |
| 0.7243055555555555 | 0 |
| 0.725 | 0 |
| 0.7256944444444445 | 0 |
| 0.7263888888888889 | 0 |
| 0.7270833333333333 | 0 |
| 0.7277777777777777 | 0 |
| 0.7284722222222223 | 0 |
| 0.7291666666666666 | 0 |
| 0.7298611111111111 | 0 |
| 0.7305555555555556 | 0 |
| 0.7312500000000001 | 0 |
| 0.7319444444444444 | 0 |
| 0.7326388888888888 | 0 |
| 0.7333333333333334 | 0 |
| 0.7340277777777778 | 0 |
| 0.7347222222222222 | 0 |
| 0.7354166666666666 | 0 |
| 0.7361111111111112 | 0 |
| 0.7368055555555556 | 0 |
| 0.7374999999999999 | 0 |
| 0.7381944444444444 | 0 |
| 0.7388888888888889 | 0 |
| 0.7395833333333334 | 0 |
| 0.7402777777777777 | 0 |
| 0.7409722222222223 | 0 |
| 0.7416666666666667 | 0 |
| 0.7423611111111111 | 0 |
| 0.7430555555555555 | 0 |
| 0.74375 | 0 |
| 0.7444444444444445 | 0 |
| 0.7451388888888889 | 0 |
| 0.7458333333333332 | 0 |
| 0.7465277777777778 | 0 |
| 0.7472222222222222 | 0 |
| 0.7479166666666667 | 0 |
| 0.748611111111111 | 0 |
| 0.7493055555555556 | 0 |
| 0.75 | 0 |
| 0.7506944444444444 | 0 |
| 0.751388888888889 | 0 |
| 0.7520833333333333 | 0 |
| 0.7527777777777778 | 0 |
| 0.7534722222222222 | 0 |
| 0.7541666666666668 | 0 |
| 0.7548611111111111 | 0 |
| 0.7555555555555555 | 0 |
| 0.75625 | 0 |
| 0.7569444444444445 | 0 |
| 0.7576388888888889 | 0 |
| 0.7583333333333333 | 0 |
| 0.7590277777777777 | 0 |
| 0.7597222222222223 | 0 |
| 0.7604166666666666 | 0 |
| 0.7611111111111111 | 0 |
| 0.7618055555555556 | 0 |
| 0.7625000000000001 | 0 |
| 0.7631944444444444 | 0 |
| 0.7638888888888888 | 0 |
| 0.7645833333333334 | 0 |
| 0.7652777777777778 | 0 |
| 0.7659722222222222 | 0 |
| 0.7666666666666666 | 0 |
| 0.7673611111111112 | 0 |
| 0.7680555555555556 | 0 |
| 0.7687499999999999 | 0 |
| 0.7694444444444444 | 0 |
| 0.7701388888888889 | 0 |
| 0.7708333333333334 | 0 |
| 0.7715277777777777 | 0 |
| 0.7722222222222223 | 0 |
| 0.7729166666666667 | 0 |
| 0.7736111111111111 | 0 |
| 0.7743055555555555 | 0 |
| 0.775 | 0 |
| 0.7756944444444445 | 0 |
| 0.7763888888888889 | 0 |
| 0.7770833333333332 | 0 |
| 0.7777777777777778 | 0 |
| 0.7784722222222222 | 0 |
| 0.7791666666666667 | 0 |
| 0.779861111111111 | 0 |
| 0.7805555555555556 | 0 |
| 0.78125 | 0 |
| 0.7819444444444444 | 0 |
| 0.782638888888889 | 0 |
| 0.7833333333333333 | 0 |
| 0.7840277777777778 | 0 |
| 0.7847222222222222 | 0 |
| 0.7854166666666668 | 0 |
| 0.7861111111111111 | 0 |
| 0.7868055555555555 | 0 |
| 0.7875 | 0 |
| 0.7881944444444445 | 0 |
| 0.7888888888888889 | 0 |
| 0.7895833333333333 | 0 |
| 0.7902777777777777 | 0 |
| 0.7909722222222223 | 0 |
| 0.7916666666666666 | 0 |
| 0.7923611111111111 | 0 |
| 0.7930555555555556 | 0 |
| 0.7937500000000001 | 0 |
| 0.7944444444444444 | 0 |
| 0.7951388888888888 | 0 |
| 0.7958333333333334 | 0 |
| 0.7965277777777778 | 0 |
| 0.7972222222222222 | 0 |
| 0.7979166666666666 | 0 |
| 0.7986111111111112 | 0 |
| 0.7993055555555556 | 0 |
| 0.7999999999999999 | 0 |
| 0.8006944444444444 | 0 |
| 0.8013888888888889 | 0 |
| 0.8020833333333334 | 0 |
| 0.8027777777777777 | 0 |
| 0.8034722222222223 | 0 |
| 0.8041666666666667 | 0 |
| 0.8048611111111111 | 0 |
| 0.8055555555555555 | 0 |
| 0.80625 | 0 |
| 0.8069444444444445 | 0 |
| 0.8076388888888889 | 0 |
| 0.8083333333333332 | 0 |
| 0.8090277777777778 | 0 |
| 0.8097222222222222 | 0 |
| 0.8104166666666667 | 0 |
| 0.811111111111111 | 0 |
| 0.8118055555555556 | 0 |
| 0.8125 | 0 |
| 0.8131944444444444 | 0 |
| 0.813888888888889 | 0 |
| 0.8145833333333333 | 0 |
| 0.8152777777777778 | 0 |
| 0.8159722222222222 | 0 |
| 0.8166666666666668 | 0 |
| 0.8173611111111111 | 0 |
| 0.8180555555555555 | 0 |
| 0.81875 | 0 |
| 0.8194444444444445 | 0 |
| 0.8201388888888889 | 0 |
| 0.8208333333333333 | 0 |
| 0.8215277777777777 | 0 |
| 0.8222222222222223 | 0 |
| 0.8229166666666666 | 0 |
| 0.8236111111111111 | 0 |
| 0.8243055555555556 | 0 |
| 0.8250000000000001 | 0 |
| 0.8256944444444444 | 0 |
| 0.8263888888888888 | 0 |
| 0.8270833333333334 | 0 |
| 0.8277777777777778 | 0 |
| 0.8284722222222222 | 0 |
| 0.8291666666666666 | 0 |
| 0.8298611111111112 | 0 |
| 0.8305555555555556 | 0 |
| 0.8312499999999999 | 0 |
| 0.8319444444444444 | 0 |
| 0.8326388888888889 | 0 |
| 0.8333333333333334 | 0 |
| 0.8340277777777777 | 0 |
| 0.8347222222222223 | 0 |
| 0.8354166666666667 | 0 |
| 0.8361111111111111 | 0 |
| 0.8368055555555555 | 0 |
| 0.8375 | 0 |
| 0.8381944444444445 | 0 |
| 0.8388888888888889 | 0 |
| 0.8395833333333332 | 0 |
| 0.8402777777777778 | 0 |
| 0.8409722222222222 | 0 |
| 0.8416666666666667 | 0 |
| 0.842361111111111 | 0 |
| 0.8430555555555556 | 0 |
| 0.84375 | 0 |
| 0.8444444444444444 | 0 |
| 0.845138888888889 | 0 |
| 0.8458333333333333 | 0 |
| 0.8465277777777778 | 0 |
| 0.8472222222222222 | 0 |
| 0.8479166666666668 | 0 |
| 0.8486111111111111 | 0 |
| 0.8493055555555555 | 0 |
| 0.85 | 0 |
| 0.8506944444444445 | 0 |
| 0.8513888888888889 | 0 |
| 0.8520833333333333 | 0 |
| 0.8527777777777777 | 0 |
| 0.8534722222222223 | 0 |
| 0.8541666666666666 | 0 |
| 0.8548611111111111 | 0 |
| 0.8555555555555556 | 0 |
| 0.8562500000000001 | 0 |
| 0.8569444444444444 | 0 |
| 0.8576388888888888 | 0 |
| 0.8583333333333334 | 0 |
| 0.8590277777777778 | 0 |
| 0.8597222222222222 | 0 |
| 0.8604166666666666 | 0 |
| 0.8611111111111112 | 0 |
| 0.8618055555555556 | 0 |
| 0.8624999999999999 | 0 |
| 0.8631944444444444 | 0 |
| 0.8638888888888889 | 0 |
| 0.8645833333333334 | 0 |
| 0.8652777777777777 | 0 |
| 0.8659722222222223 | 0 |
| 0.8666666666666667 | 0 |
| 0.8673611111111111 | 0 |
| 0.8680555555555555 | 0 |
| 0.86875 | 0 |
| 0.8694444444444445 | 0 |
| 0.8701388888888889 | 0 |
| 0.8708333333333332 | 0 |
| 0.8715277777777778 | 0 |
| 0.8722222222222222 | 0 |
| 0.8729166666666667 | 0 |
| 0.873611111111111 | 0 |
| 0.8743055555555556 | 0 |
| 0.875 | 0 |
| 0.8756944444444444 | 0 |
| 0.876388888888889 | 0 |
| 0.8770833333333333 | 0 |
| 0.8777777777777778 | 0 |
| 0.8784722222222222 | 0 |
| 0.8791666666666668 | 0 |
| 0.8798611111111111 | 0 |
| 0.8805555555555555 | 0 |
| 0.88125 | 0 |
| 0.8819444444444445 | 0 |
| 0.8826388888888889 | 0 |
| 0.8833333333333333 | 0 |
| 0.8840277777777777 | 0 |
| 0.8847222222222223 | 0 |
| 0.8854166666666666 | 0 |
| 0.8861111111111111 | 0 |
| 0.8868055555555556 | 0 |
| 0.8875000000000001 | 0 |
| 0.8881944444444444 | 0 |
| 0.8888888888888888 | 0 |
| 0.8895833333333334 | 0 |
| 0.8902777777777778 | 0 |
| 0.8909722222222222 | 0 |
| 0.8916666666666666 | 0 |
| 0.8923611111111112 | 0 |
| 0.8930555555555556 | 0 |
| 0.8937499999999999 | 0 |
| 0.8944444444444444 | 0 |
| 0.8951388888888889 | 0 |
| 0.8958333333333334 | 0 |
| 0.8965277777777777 | 0 |
| 0.8972222222222223 | 0 |
| 0.8979166666666667 | 0 |
| 0.8986111111111111 | 0 |
| 0.8993055555555555 | 0 |
| 0.9 | 0 |
| 0.9006944444444445 | 0 |
| 0.9013888888888889 | 0 |
| 0.9020833333333332 | 0 |
| 0.9027777777777778 | 0 |
| 0.9034722222222222 | 0 |
| 0.9041666666666667 | 0 |
| 0.904861111111111 | 0 |
| 0.9055555555555556 | 0 |
| 0.90625 | 0 |
| 0.9069444444444444 | 0 |
| 0.907638888888889 | 0 |
| 0.9083333333333333 | 0 |
| 0.9090277777777778 | 0 |
| 0.9097222222222222 | 0 |
| 0.9104166666666668 | 0 |
| 0.9111111111111111 | 0 |
| 0.9118055555555555 | 0 |
| 0.9125 | 0 |
| 0.9131944444444445 | 0 |
| 0.9138888888888889 | 0 |
| 0.9145833333333333 | 0 |
| 0.9152777777777777 | 0 |
| 0.9159722222222223 | 0 |
| 0.9166666666666666 | 0 |
| 0.9173611111111111 | 0 |
| 0.9180555555555556 | 0 |
| 0.9187500000000001 | 0 |
| 0.9194444444444444 | 0 |
| 0.9201388888888888 | 0 |
| 0.9208333333333334 | 0 |
| 0.9215277777777778 | 0 |
| 0.9222222222222222 | 0 |
| 0.9229166666666666 | 0 |
| 0.9236111111111112 | 0 |
| 0.9243055555555556 | 0 |
| 0.9249999999999999 | 0 |
| 0.9256944444444444 | 0 |
| 0.9263888888888889 | 0 |
| 0.9270833333333334 | 0 |
| 0.9277777777777777 | 0 |
| 0.9284722222222223 | 0 |
| 0.9291666666666667 | 0 |
| 0.9298611111111111 | 0 |
| 0.9305555555555555 | 0 |
| 0.93125 | 0 |
| 0.9319444444444445 | 0 |
| 0.9326388888888889 | 0 |
| 0.9333333333333332 | 0 |
| 0.9340277777777778 | 0 |
| 0.9347222222222222 | 0 |
| 0.9354166666666667 | 0 |
| 0.936111111111111 | 0 |
| 0.9368055555555556 | 0 |
| 0.9375 | 0 |
| 0.9381944444444444 | 0 |
| 0.938888888888889 | 0 |
| 0.9395833333333333 | 0 |
| 0.9402777777777778 | 0 |
| 0.9409722222222222 | 0 |
| 0.9416666666666668 | 0 |
| 0.9423611111111111 | 0 |
| 0.9430555555555555 | 0 |
| 0.94375 | 0 |
| 0.9444444444444445 | 0 |
| 0.9451388888888889 | 0 |
| 0.9458333333333333 | 0 |
| 0.9465277777777777 | 0 |
| 0.9472222222222223 | 0 |
| 0.9479166666666666 | 0 |
| 0.9486111111111111 | 0 |
| 0.9493055555555556 | 0 |
| 0.9500000000000001 | 0 |
| 0.9506944444444444 | 0 |
| 0.9513888888888888 | 0 |
| 0.9520833333333334 | 0 |
| 0.9527777777777778 | 0 |
| 0.9534722222222222 | 0 |
| 0.9541666666666666 | 0 |
| 0.9548611111111112 | 0 |
| 0.9555555555555556 | 0 |
| 0.9562499999999999 | 0 |
| 0.9569444444444444 | 0 |
| 0.9576388888888889 | 0 |
| 0.9583333333333334 | 0 |
| 0.9590277777777777 | 0 |
| 0.9597222222222223 | 0 |
| 0.9604166666666667 | 0 |
| 0.9611111111111111 | 0 |
| 0.9618055555555555 | 0 |
| 0.9625 | 0 |
| 0.9631944444444445 | 0 |
| 0.9638888888888889 | 0 |
| 0.9645833333333332 | 0 |
| 0.9652777777777778 | 0 |
| 0.9659722222222222 | 0 |
| 0.9666666666666667 | 0 |
| 0.967361111111111 | 0 |
| 0.9680555555555556 | 0 |
| 0.96875 | 0 |
| 0.9694444444444444 | 0 |
| 0.970138888888889 | 0 |
| 0.9708333333333333 | 0 |
| 0.9715277777777778 | 0 |
| 0.9722222222222222 | 0 |
| 0.9729166666666668 | 0 |
| 0.9736111111111111 | 0 |
| 0.9743055555555555 | 0 |
| 0.975 | 0 |
| 0.9756944444444445 | 0 |
| 0.9763888888888889 | 0 |
| 0.9770833333333333 | 0 |
| 0.9777777777777777 | 0 |
| 0.9784722222222223 | 0 |
| 0.9791666666666666 | 0 |
| 0.9798611111111111 | 0 |
| 0.9805555555555556 | 0 |
| 0.9812500000000001 | 0 |
| 0.9819444444444444 | 0 |
| 0.9826388888888888 | 0 |
| 0.9833333333333334 | 0 |
| 0.9840277777777778 | 0 |
| 0.9847222222222222 | 0 |
| 0.9854166666666666 | 0 |
| 0.9861111111111112 | 0 |
| 0.9868055555555556 | 0 |
| 0.9874999999999999 | 0 |
| 0.9881944444444444 | 0 |
| 0.9888888888888889 | 0 |
| 0.9895833333333334 | 0 |
| 0.9902777777777777 | 0 |
| 0.9909722222222223 | 0 |
| 0.9916666666666667 | 0 |
| 0.9923611111111111 | 0 |
| 0.9930555555555555 | 0 |
| 0.99375 | 0 |
| 0.9944444444444445 | 0 |
| 0.9951388888888889 | 0 |
| 0.9958333333333332 | 0 |
| 0.9965277777777778 | 0 |
| 0.9972222222222222 | 0 |
| 0.9979166666666667 | 0 |
| 0.998611111111111 | 0 |
| 0.9993055555555556 | 0 |